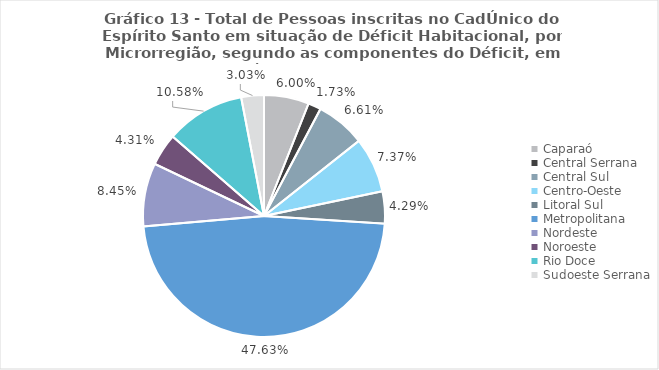
| Category | Series 0 |
|---|---|
| Caparaó | 0.06 |
| Central Serrana | 0.017 |
| Central Sul | 0.066 |
| Centro-Oeste | 0.074 |
| Litoral Sul | 0.043 |
| Metropolitana | 0.476 |
| Nordeste | 0.084 |
| Noroeste | 0.043 |
| Rio Doce | 0.106 |
| Sudoeste Serrana | 0.03 |